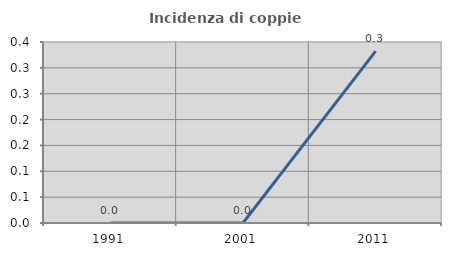
| Category | Incidenza di coppie miste |
|---|---|
| 1991.0 | 0 |
| 2001.0 | 0 |
| 2011.0 | 0.332 |